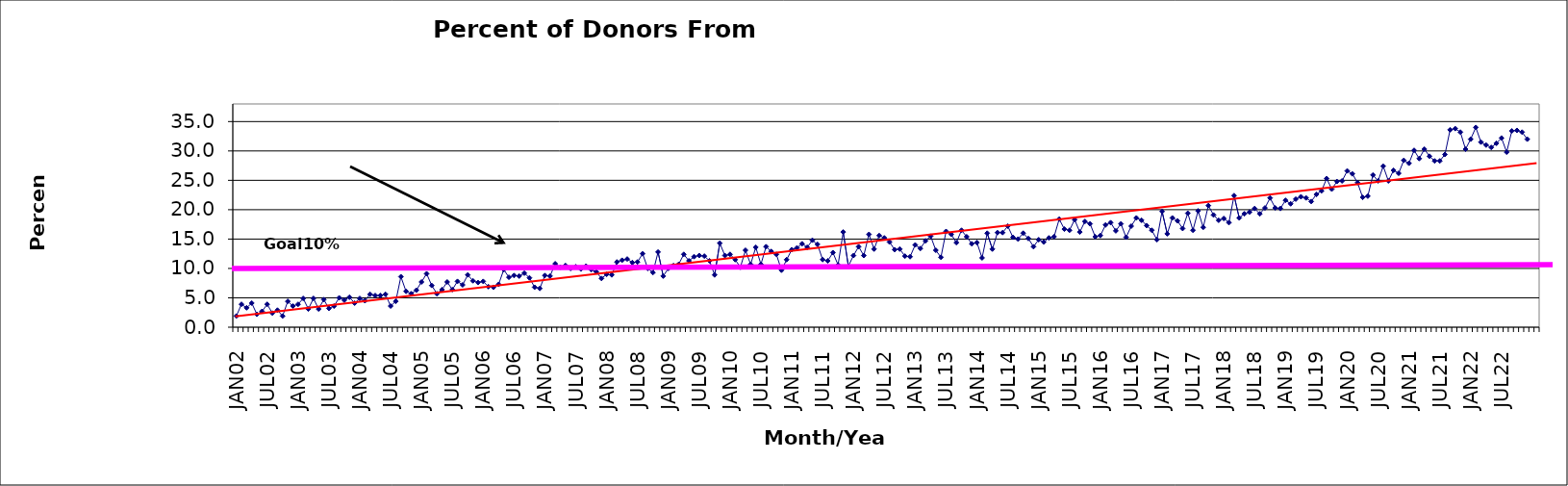
| Category | Series 0 |
|---|---|
| JAN02 | 1.9 |
| FEB02 | 3.9 |
| MAR02 | 3.3 |
| APR02 | 4.1 |
| MAY02 | 2.2 |
| JUN02 | 2.7 |
| JUL02 | 3.9 |
| AUG02 | 2.4 |
| SEP02 | 2.9 |
| OCT02 | 1.9 |
| NOV02 | 4.4 |
| DEC02 | 3.6 |
| JAN03 | 3.9 |
| FEB03 | 4.9 |
| MAR03 | 3.1 |
| APR03 | 4.9 |
| MAY03 | 3.1 |
| JUN03 | 4.7 |
| JUL03 | 3.2 |
| AUG03 | 3.6 |
| SEP03 | 5 |
| OCT03 | 4.6 |
| NOV03 | 5.1 |
| DEC03 | 4.1 |
| JAN04 | 4.9 |
| FEB04 | 4.5 |
| MAR04 | 5.6 |
| APR04 | 5.4 |
| MAY04 | 5.4 |
| JUN04 | 5.6 |
| JUL04 | 3.6 |
| AUG04 | 4.4 |
| SEP04 | 8.6 |
| OCT04 | 6.1 |
| NOV04 | 5.7 |
| DEC04 | 6.3 |
| JAN05 | 7.7 |
| FEB05 | 9.1 |
| MAR05 | 7.1 |
| APR05 | 5.7 |
| MAY05 | 6.4 |
| JUN05 | 7.7 |
| JUL05 | 6.4 |
| AUG05 | 7.8 |
| SEP05 | 7.2 |
| OCT05 | 8.9 |
| NOV05 | 7.9 |
| DEC05 | 7.6 |
| JAN06 | 7.8 |
| FEB06 | 6.9 |
| MAR06 | 6.8 |
| APR06 | 7.3 |
| MAY06 | 9.8 |
| JUN06 | 8.5 |
| JUL06 | 8.8 |
| AUG06 | 8.7 |
| SEP06 | 9.2 |
| OCT06 | 8.4 |
| NOV06 | 6.8 |
| DEC06 | 6.6 |
| JAN07 | 8.8 |
| FEB07 | 8.7 |
| MAR07 | 10.8 |
| APR07 | 10.2 |
| MAY07 | 10.5 |
| JUN07 | 10 |
| JUL07 | 10.3 |
| AUG07 | 9.9 |
| SEP07 | 10.4 |
| OCT07 | 9.8 |
| NOV07 | 9.4 |
| DEC07 | 8.3 |
| JAN08 | 9 |
| FEB08 | 8.9 |
| MAR08 | 11.1 |
| APR08 | 11.4 |
| MAY08 | 11.6 |
| JUN08 | 11 |
| JUL08 | 11.1 |
| AUG08 | 12.5 |
| SEP08 | 10 |
| OCT08 | 9.3 |
| NOV08 | 12.8 |
| DEC08 | 8.7 |
| JAN09 | 10 |
| FEB09 | 10.5 |
| MAR09 | 10.7 |
| APR09 | 12.4 |
| MAY09 | 11.3 |
| JUN09 | 12 |
| JUL09 | 12.2 |
| AUG09 | 12.1 |
| SEP09 | 11.3 |
| OCT09 | 8.9 |
| NOV09 | 14.3 |
| DEC09 | 12.2 |
| JAN10 | 12.4 |
| FEB10 | 11.5 |
| MAR10 | 10.2 |
| APR10 | 13.1 |
| MAY10 | 10.7 |
| JUN10 | 13.6 |
| JUL10 | 10.7 |
| AUG10 | 13.7 |
| SEP10 | 12.9 |
| OCT10 | 12.4 |
| NOV10 | 9.7 |
| DEC10 | 11.5 |
| JAN11 | 13.2 |
| FEB11 | 13.5 |
| MAR11 | 14.2 |
| APR11 | 13.6 |
| MAY11 | 14.8 |
| JUN11 | 14.1 |
| JUL11 | 11.5 |
| AUG11 | 11.3 |
| SEP11 | 12.7 |
| OCT11 | 10.6 |
| NOV11 | 16.2 |
| DEC11 | 10.4 |
| JAN12 | 12.2 |
| FEB12 | 13.7 |
| MAR12 | 12.2 |
| APR12 | 15.8 |
| MAY12 | 13.3 |
| JUN12 | 15.6 |
| JUL12 | 15.2 |
| AUG12 | 14.5 |
| SEP12 | 13.2 |
| OCT12 | 13.3 |
| NOV12 | 12.1 |
| DEC12 | 12 |
| JAN13 | 14 |
| FEB13 | 13.4 |
| MAR13 | 14.7 |
| APR13 | 15.5 |
| MAY13 | 13.1 |
| JUN13 | 11.9 |
| JUL13 | 16.3 |
| AUG13 | 15.8 |
| SEP13 | 14.4 |
| OCT13 | 16.5 |
| NOV13 | 15.4 |
| DEC13 | 14.2 |
| JAN14 | 14.4 |
| FEB14 | 11.8 |
| MAR14 | 16 |
| APR14 | 13.3 |
| MAY14 | 16.1 |
| JUN14 | 16.1 |
| JUL14 | 17.2 |
| AUG14 | 15.3 |
| SEP14 | 15 |
| OCT14 | 16 |
| NOV14 | 15.1 |
| DEC14 | 13.7 |
| JAN15 | 14.9 |
| FEB15 | 14.5 |
| MAR15 | 15.2 |
| APR15 | 15.4 |
| MAY15 | 18.4 |
| JUN15 | 16.7 |
| JUL15 | 16.5 |
| AUG15 | 18.3 |
| SEP15 | 16.2 |
| OCT15 | 18 |
| NOV15 | 17.6 |
| DEC15 | 15.4 |
| JAN16 | 15.6 |
| FEB16 | 17.4 |
| MAR16 | 17.8 |
| APR16 | 16.4 |
| MAY16 | 17.6 |
| JUN16 | 15.3 |
| JUL16 | 17.2 |
| AUG16 | 18.6 |
| SEP16 | 18.2 |
| OCT16 | 17.3 |
| NOV16 | 16.5 |
| DEC16 | 14.9 |
| JAN17 | 19.7 |
| FEB17 | 15.9 |
| MAR17 | 18.6 |
| APR17 | 18.1 |
| MAY17 | 16.8 |
| JUN17 | 19.4 |
| JUL17 | 16.5 |
| AUG17 | 19.8 |
| SEP17 | 17 |
| OCT17 | 20.7 |
| NOV17 | 19.1 |
| DEC17 | 18.2 |
| JAN18 | 18.5 |
| FEB18 | 17.8 |
| MAR18 | 22.4 |
| APR18 | 18.6 |
| MAY18 | 19.3 |
| JUN18 | 19.6 |
| JUL18 | 20.2 |
| AUG18 | 19.3 |
| SEP18 | 20.3 |
| OCT18 | 22 |
| NOV18 | 20.3 |
| DEC18 | 20.2 |
| JAN19 | 21.6 |
| FEB19 | 21 |
| MAR19 | 21.8 |
| APR19 | 22.2 |
| MAY19 | 22 |
| JUN19 | 21.4 |
| JUL19 | 22.6 |
| AUG19 | 23.2 |
| SEP19 | 25.3 |
| OCT19 | 23.5 |
| NOV19 | 24.8 |
| DEC19 | 24.9 |
| JAN20 | 26.6 |
| FEB20 | 26.1 |
| MAR20 | 24.6 |
| APR20 | 22.1 |
| MAY20 | 22.3 |
| JUN20 | 25.9 |
| JUL20 | 24.9 |
| AUG20 | 27.4 |
| SEP20 | 24.9 |
| OCT20 | 26.7 |
| NOV20 | 26.2 |
| DEC20 | 28.4 |
| JAN21 | 27.9 |
| FEB21 | 30.1 |
| MAR21 | 28.7 |
| APR21 | 30.3 |
| MAY21 | 29.1 |
| JUN21 | 28.3 |
| JUL21 | 28.3 |
| AUG21 | 29.4 |
| SEP21 | 33.6 |
| OCT21 | 33.8 |
| NOV21 | 33.2 |
| DEC21 | 30.3 |
| JAN22 | 32 |
| FEB22 | 34 |
| MAR22 | 31.5 |
| APR22 | 31 |
| MAY22 | 30.6 |
| JUN22 | 31.3 |
| JUL22 | 32.2 |
| AUG22 | 29.8 |
| SEP22 | 33.4 |
| OCT22 | 33.5 |
| NOV22 | 33.2 |
| DEC22 | 32 |